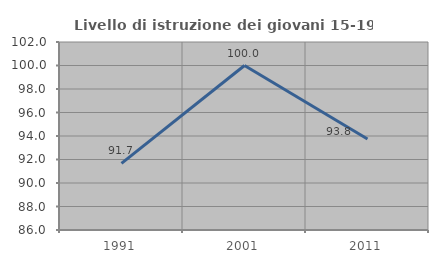
| Category | Livello di istruzione dei giovani 15-19 anni |
|---|---|
| 1991.0 | 91.667 |
| 2001.0 | 100 |
| 2011.0 | 93.75 |